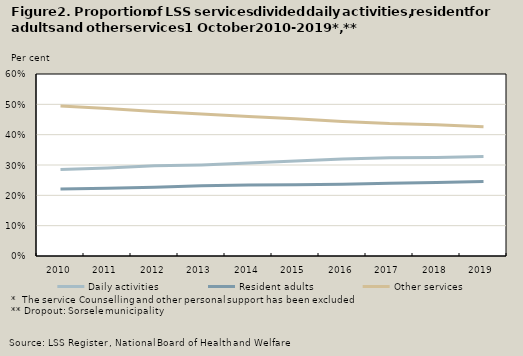
| Category | Daily activities | Resident adults | Other services |
|---|---|---|---|
| 2010.0 | 0.285 | 0.221 | 0.494 |
| 2011.0 | 0.29 | 0.223 | 0.486 |
| 2012.0 | 0.297 | 0.227 | 0.476 |
| 2013.0 | 0.3 | 0.232 | 0.468 |
| 2014.0 | 0.306 | 0.234 | 0.46 |
| 2015.0 | 0.313 | 0.235 | 0.452 |
| 2016.0 | 0.32 | 0.237 | 0.444 |
| 2017.0 | 0.324 | 0.24 | 0.437 |
| 2018.0 | 0.325 | 0.242 | 0.433 |
| 2019.0 | 0.328 | 0.246 | 0.426 |